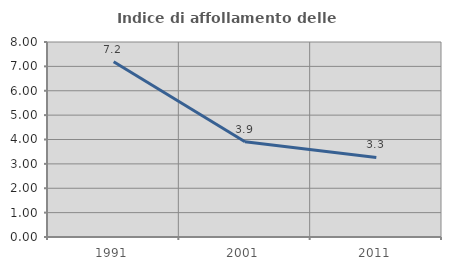
| Category | Indice di affollamento delle abitazioni  |
|---|---|
| 1991.0 | 7.191 |
| 2001.0 | 3.91 |
| 2011.0 | 3.264 |